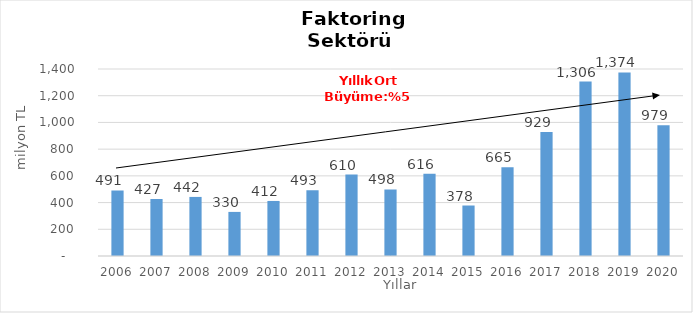
| Category | Faktoring  |
|---|---|
| 2006.0 | 490.834 |
| 2007.0 | 426.554 |
| 2008.0 | 442.315 |
| 2009.0 | 330.082 |
| 2010.0 | 412.077 |
| 2011.0 | 492.71 |
| 2012.0 | 610.081 |
| 2013.0 | 498.446 |
| 2014.0 | 616 |
| 2015.0 | 378 |
| 2016.0 | 665 |
| 2017.0 | 929 |
| 2018.0 | 1306 |
| 2019.0 | 1374 |
| 2020.0 | 979 |